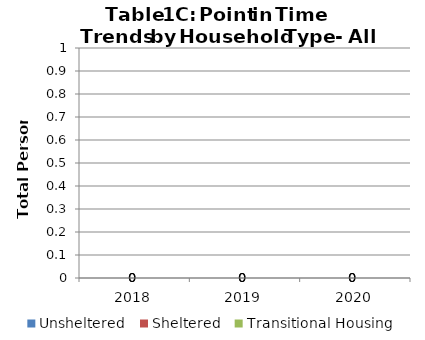
| Category | Unsheltered | Sheltered | Transitional Housing |
|---|---|---|---|
| 2018.0 | 0 | 0 | 0 |
| 2019.0 | 0 | 0 | 0 |
| 2020.0 | 0 | 0 | 0 |